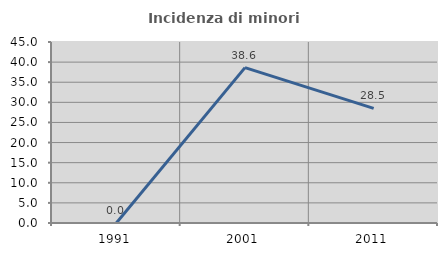
| Category | Incidenza di minori stranieri |
|---|---|
| 1991.0 | 0 |
| 2001.0 | 38.636 |
| 2011.0 | 28.485 |